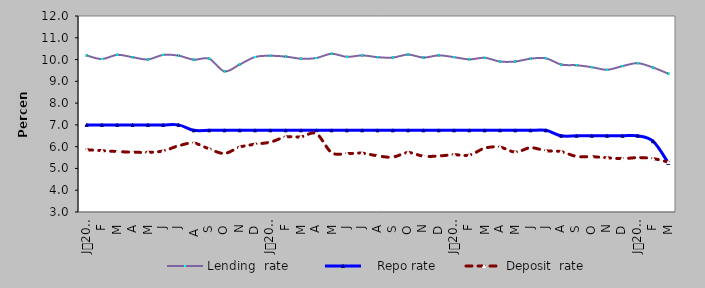
| Category | Lending  rate |    Repo rate | Deposit  rate |
|---|---|---|---|
| 0 | 10.187 | 7 | 5.858 |
| 1900-01-01 | 10.024 | 7 | 5.815 |
| 1900-01-02 | 10.218 | 7 | 5.776 |
| 1900-01-03 | 10.107 | 7 | 5.746 |
| 1900-01-04 | 10.004 | 7 | 5.74 |
| 1900-01-05 | 10.214 | 7 | 5.804 |
| 1900-01-06 | 10.18 | 7 | 6.04 |
| 1900-01-07 | 9.994 | 6.75 | 6.162 |
| 1900-01-08 | 10.042 | 6.75 | 5.898 |
| 1900-01-09 | 9.46 | 6.75 | 5.69 |
| 1900-01-10 | 9.774 | 6.75 | 5.98 |
| 1900-01-11 | 10.117 | 6.75 | 6.113 |
| 1900-01-12 | 10.174 | 6.75 | 6.207 |
| 1900-01-13 | 10.136 | 6.75 | 6.446 |
| 1900-01-14 | 10.04 | 6.75 | 6.45 |
| 1900-01-15 | 10.07 | 6.75 | 6.6 |
| 1900-01-16 | 10.265 | 6.75 | 5.728 |
| 1900-01-17 | 10.125 | 6.75 | 5.682 |
| 1900-01-18 | 10.19 | 6.75 | 5.7 |
| 1900-01-19 | 10.11 | 6.75 | 5.58 |
| 1900-01-20 | 10.09 | 6.75 | 5.52 |
| 1900-01-21 | 10.23 | 6.75 | 5.73 |
| 1900-01-22 | 10.09 | 6.75 | 5.56 |
| 1900-01-23 | 10.192 | 6.75 | 5.572 |
| 1900-01-24 | 10.11 | 6.75 | 5.63 |
| 1900-01-25 | 10.01 | 6.75 | 5.61 |
| 1900-01-26 | 10.08 | 6.75 | 5.93 |
| 1900-01-27 | 9.91 | 6.75 | 5.98 |
| 1900-01-28 | 9.91 | 6.75 | 5.75 |
| 1900-01-29 | 10.04 | 6.75 | 5.95 |
| 1900-01-30 | 10.06 | 6.75 | 5.813 |
| 1900-01-31 | 9.77 | 6.5 | 5.77 |
| 1900-02-01 | 9.74 | 6.5 | 5.55 |
| 1900-02-02 | 9.65 | 6.5 | 5.54 |
| 1900-02-03 | 9.53 | 6.5 | 5.49 |
| 1900-02-04 | 9.7 | 6.5 | 5.45 |
| 1900-02-05 | 9.833 | 6.5 | 5.497 |
| 1900-02-06 | 9.634 | 6.25 | 5.454 |
| 1900-02-07 | 9.35 | 5.25 | 5.29 |